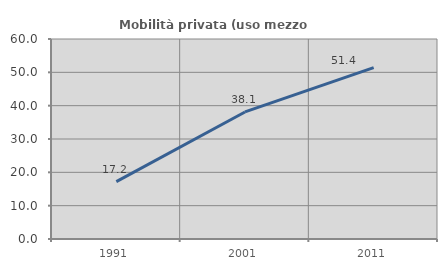
| Category | Mobilità privata (uso mezzo privato) |
|---|---|
| 1991.0 | 17.216 |
| 2001.0 | 38.113 |
| 2011.0 | 51.408 |